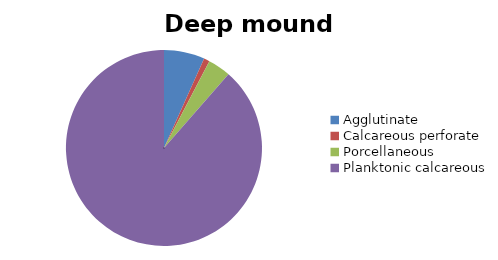
| Category | Deep mound chain |
|---|---|
| ﻿Agglutinate | 6.718 |
| Calcareous perforate | 0.947 |
| Porcellaneous | 3.762 |
| Planktonic calcareous | 88.574 |